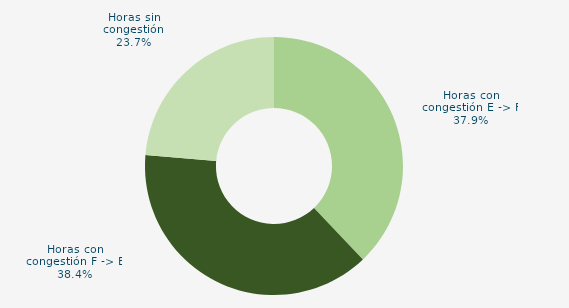
| Category | Horas con congestión E -> F |
|---|---|
| Horas con congestión E -> F | 37.903 |
| Horas con congestión F -> E | 38.441 |
| Horas sin congestión | 23.656 |